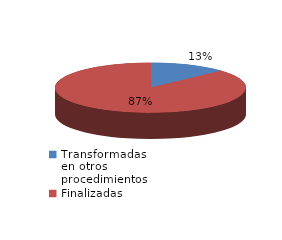
| Category | Series 0 |
|---|---|
| Transformadas en otros procedimientos | 6716 |
| Finalizadas | 44669 |